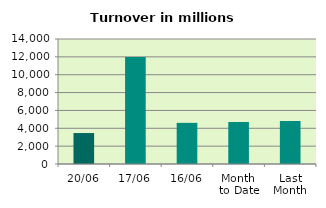
| Category | Series 0 |
|---|---|
| 20/06 | 3468.367 |
| 17/06 | 11997.403 |
| 16/06 | 4607.112 |
| Month 
to Date | 4715.74 |
| Last
Month | 4818.103 |